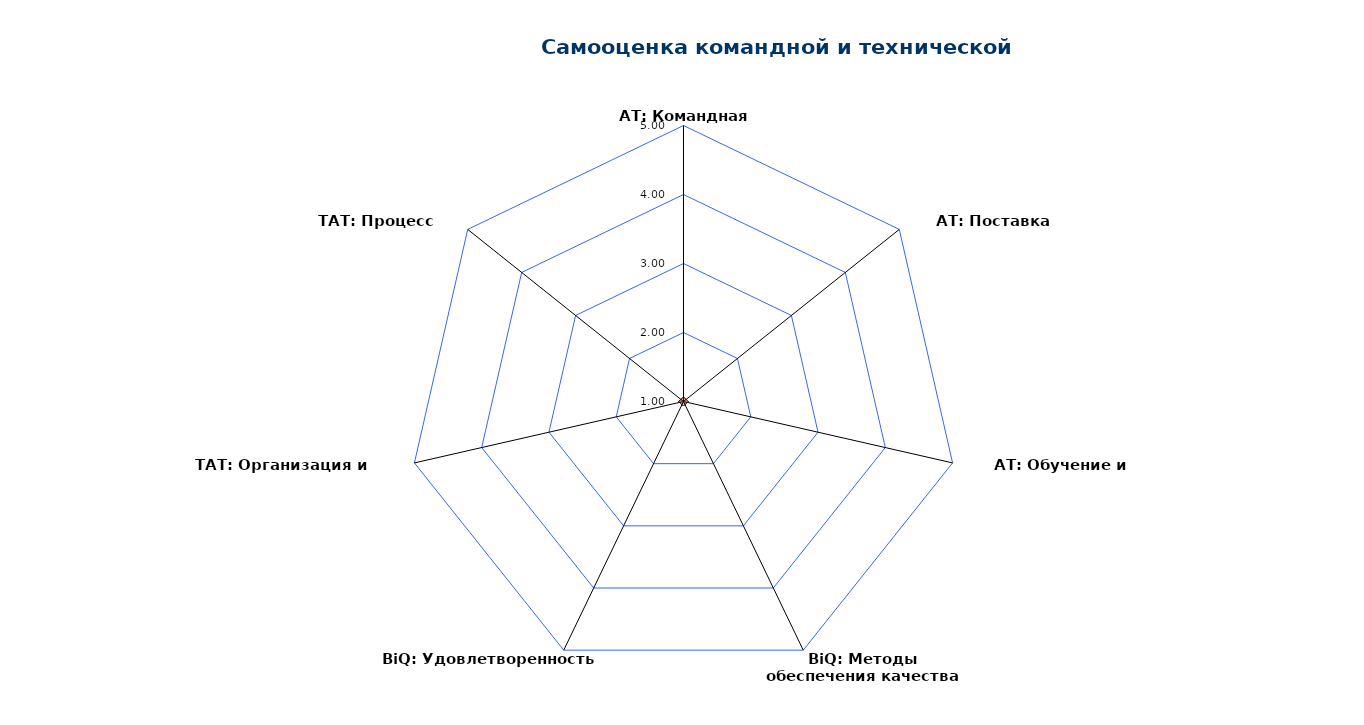
| Category | Series 0 |
|---|---|
| AT: Командная работа | 1 |
| AT: Поставка ценности | 1 |
| AT: Обучение и улучшение | 1 |
| BiQ: Методы обеспечения качества | 1 |
| BiQ: Удовлетворенность клиентов | 1 |
| TAT: Организация и согласование | 1 |
| TAT: Процесс поставки | 1 |